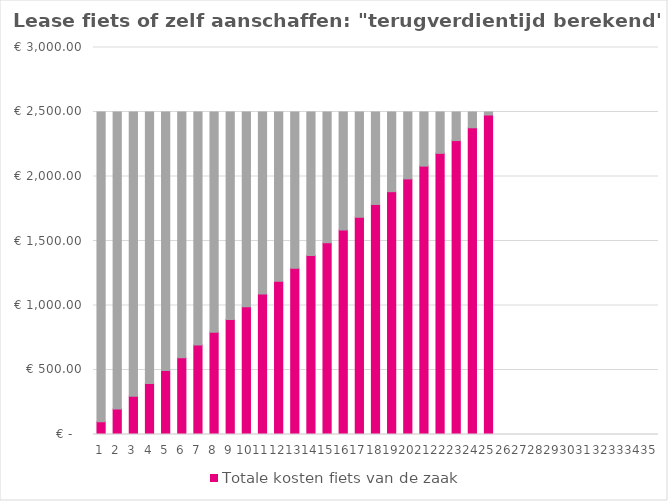
| Category | Totale kosten fiets van de zaak | blabla |
|---|---|---|
| 0 | 99.069 | 2400.931 |
| 1 | 198.138 | 2301.862 |
| 2 | 297.206 | 2202.794 |
| 3 | 396.275 | 2103.725 |
| 4 | 495.344 | 2004.656 |
| 5 | 594.412 | 1905.588 |
| 6 | 693.481 | 1806.519 |
| 7 | 792.55 | 1707.45 |
| 8 | 891.619 | 1608.381 |
| 9 | 990.688 | 1509.312 |
| 10 | 1089.756 | 1410.244 |
| 11 | 1188.825 | 1311.175 |
| 12 | 1287.894 | 1212.106 |
| 13 | 1386.962 | 1113.038 |
| 14 | 1486.031 | 1013.969 |
| 15 | 1585.1 | 914.9 |
| 16 | 1684.169 | 815.831 |
| 17 | 1783.238 | 716.762 |
| 18 | 1882.306 | 617.694 |
| 19 | 1981.375 | 518.625 |
| 20 | 2080.444 | 419.556 |
| 21 | 2179.512 | 320.488 |
| 22 | 2278.581 | 221.419 |
| 23 | 2377.65 | 122.35 |
| 24 | 2476.719 | 23.281 |
| 25 | 0 | 0 |
| 26 | 0 | 0 |
| 27 | 0 | 0 |
| 28 | 0 | 0 |
| 29 | 0 | 0 |
| 30 | 0 | 0 |
| 31 | 0 | 0 |
| 32 | 0 | 0 |
| 33 | 0 | 0 |
| 34 | 0 | 0 |